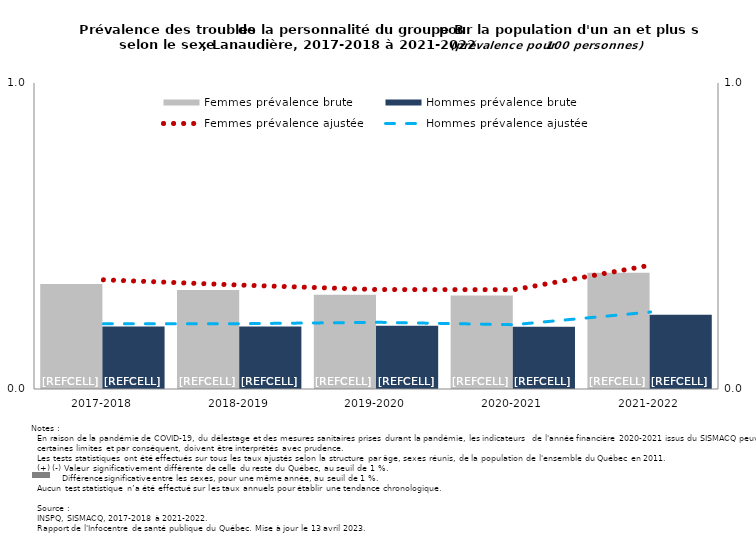
| Category | Femmes prévalence brute | Hommes prévalence brute |
|---|---|---|
| 2017-2018 | 0.343 | 0.205 |
| 2018-2019 | 0.324 | 0.204 |
| 2019-2020 | 0.308 | 0.207 |
| 2020-2021 | 0.306 | 0.203 |
| 2021-2022 | 0.38 | 0.242 |